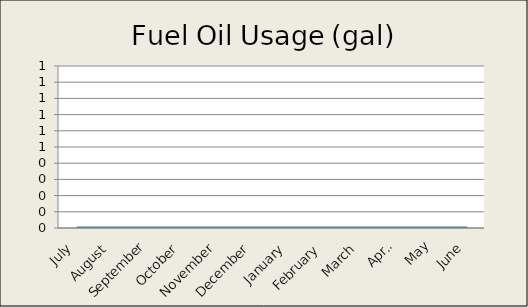
| Category | Fuel Oil Usage (gal) |
|---|---|
| 0 | 0 |
| 1 | 0 |
| 2 | 0 |
| 3 | 0 |
| 4 | 0 |
| 5 | 0 |
| 6 | 0 |
| 7 | 0 |
| 8 | 0 |
| 9 | 0 |
| 10 | 0 |
| 11 | 0 |